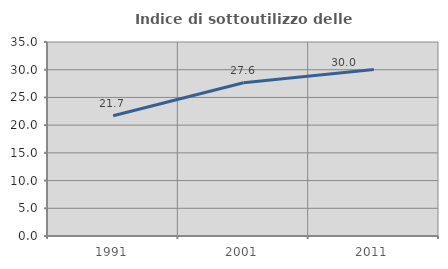
| Category | Indice di sottoutilizzo delle abitazioni  |
|---|---|
| 1991.0 | 21.699 |
| 2001.0 | 27.638 |
| 2011.0 | 30.025 |